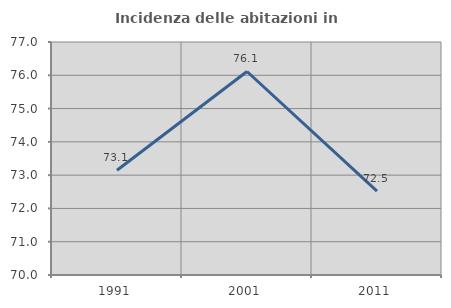
| Category | Incidenza delle abitazioni in proprietà  |
|---|---|
| 1991.0 | 73.146 |
| 2001.0 | 76.114 |
| 2011.0 | 72.519 |